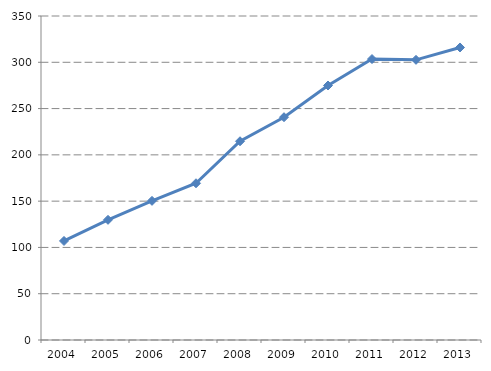
| Category | Series 0 |
|---|---|
| 2004.0 | 107.004 |
| 2005.0 | 129.817 |
| 2006.0 | 150.316 |
| 2007.0 | 169.313 |
| 2008.0 | 214.698 |
| 2009.0 | 240.677 |
| 2010.0 | 274.926 |
| 2011.0 | 303.5 |
| 2012.0 | 302.646 |
| 2013.0 | 315.991 |